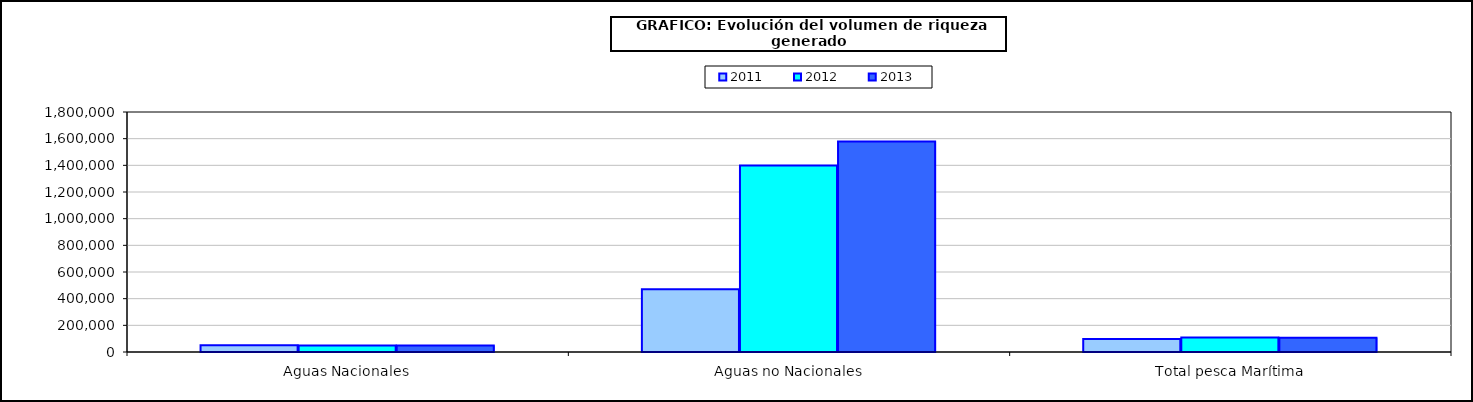
| Category | 2011 | 2012 | 2013 |
|---|---|---|---|
| 0 | 49907.979 | 48903.823 | 49553.023 |
| 1 | 470715.698 | 1399085.139 | 1578467.456 |
| 2 | 97970.238 | 108733.18 | 107603.704 |